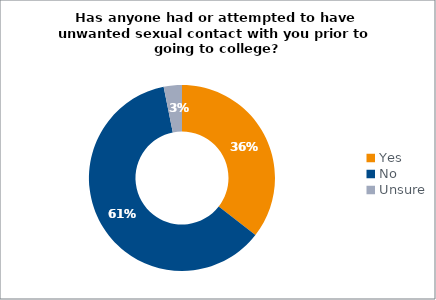
| Category | Series 0 |
|---|---|
| Yes | 0.355 |
| No | 0.613 |
| Unsure | 0.032 |